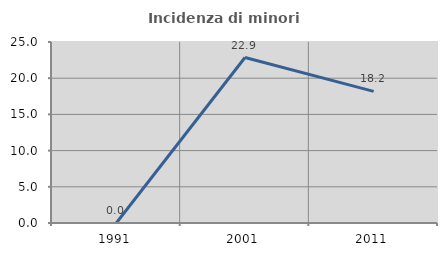
| Category | Incidenza di minori stranieri |
|---|---|
| 1991.0 | 0 |
| 2001.0 | 22.857 |
| 2011.0 | 18.182 |